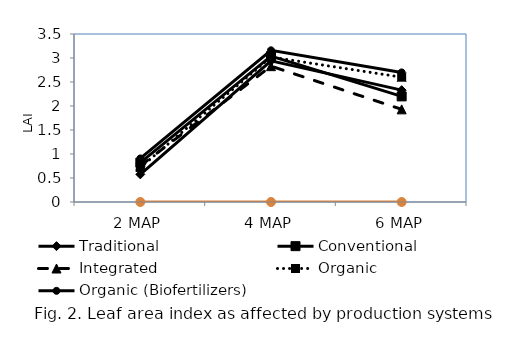
| Category | Traditional | Conventional | Integrated | Organic  | Organic (Biofertilizers) | Series 5 |
|---|---|---|---|---|---|---|
| 2 MAP | 0.576 | 0.82 | 0.754 | 0.72 | 0.908 |  |
| 4 MAP | 2.94 | 3.04 | 2.83 | 3.02 | 3.16 |  |
| 6 MAP | 2.33 | 2.2 | 1.93 | 2.6 | 2.7 |  |